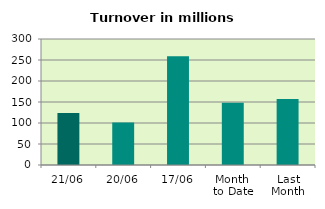
| Category | Series 0 |
|---|---|
| 21/06 | 123.902 |
| 20/06 | 101.441 |
| 17/06 | 259.175 |
| Month 
to Date | 148.294 |
| Last
Month | 157.265 |